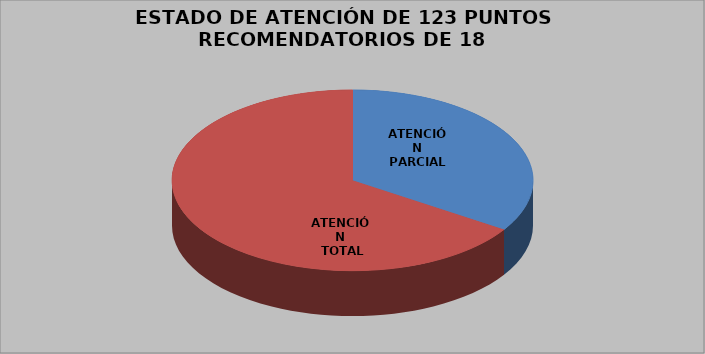
| Category | ESTADO DE ATENCIÓN DE 123 PUNTOS RECOMENDATORIOS |
|---|---|
| 0 | 42 |
| 1 | 81 |